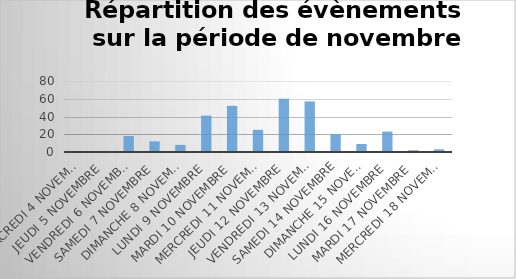
| Category | Mercredi 4 novembre |
|---|---|
| Mercredi 4 novembre | 1 |
| Jeudi 5 novembre | 1 |
| Vendredi 6 novembre | 18 |
| Samedi 7 novembre | 12 |
| Dimanche 8 novembre | 8 |
| Lundi 9 novembre | 41 |
| Mardi 10 novembre | 52 |
| Mercredi 11 novembre | 25 |
| Jeudi 12 novembre | 60 |
| Vendredi 13 novembre | 57 |
| Samedi 14 novembre | 20 |
| Dimanche 15 novembre | 9 |
| Lundi 16 novembre | 23 |
| Mardi 17 novembre | 2 |
| Mercredi 18 novembre | 3 |